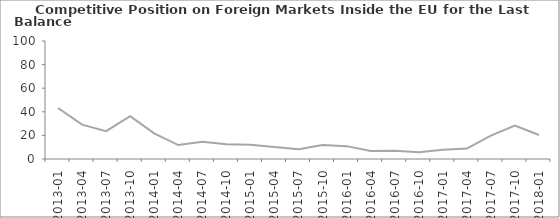
| Category | Balance |
|---|---|
| 2013-01 | 43.2 |
| 2013-04 | 29.1 |
| 2013-07 | 23.6 |
| 2013-10 | 36.3 |
| 2014-01 | 21.7 |
| 2014-04 | 11.8 |
| 2014-07 | 14.7 |
| 2014-10 | 12.6 |
| 2015-01 | 12.1 |
| 2015-04 | 10.1 |
| 2015-07 | 8.3 |
| 2015-10 | 11.9 |
| 2016-01 | 10.9 |
| 2016-04 | 6.8 |
| 2016-07 | 7 |
| 2016-10 | 5.8 |
| 2017-01 | 7.8 |
| 2017-04 | 8.8 |
| 2017-07 | 19.8 |
| 2017-10 | 28.4 |
| 2018-01 | 20.3 |